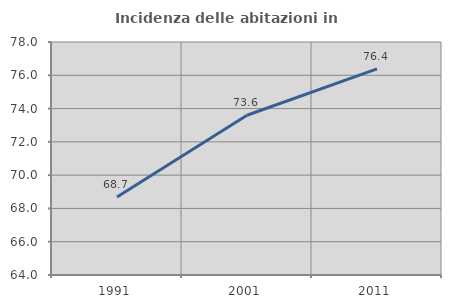
| Category | Incidenza delle abitazioni in proprietà  |
|---|---|
| 1991.0 | 68.689 |
| 2001.0 | 73.598 |
| 2011.0 | 76.38 |